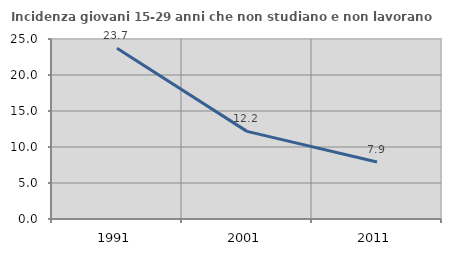
| Category | Incidenza giovani 15-29 anni che non studiano e non lavorano  |
|---|---|
| 1991.0 | 23.721 |
| 2001.0 | 12.169 |
| 2011.0 | 7.91 |